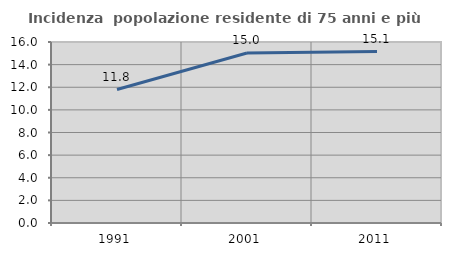
| Category | Incidenza  popolazione residente di 75 anni e più |
|---|---|
| 1991.0 | 11.799 |
| 2001.0 | 15.026 |
| 2011.0 | 15.15 |